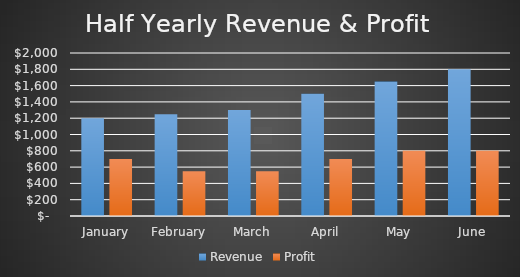
| Category | Revenue | Profit |
|---|---|---|
| January | 1200 | 700 |
| February | 1250 | 550 |
| March | 1300 | 550 |
| April | 1500 | 700 |
| May | 1650 | 800 |
| June | 1800 | 800 |